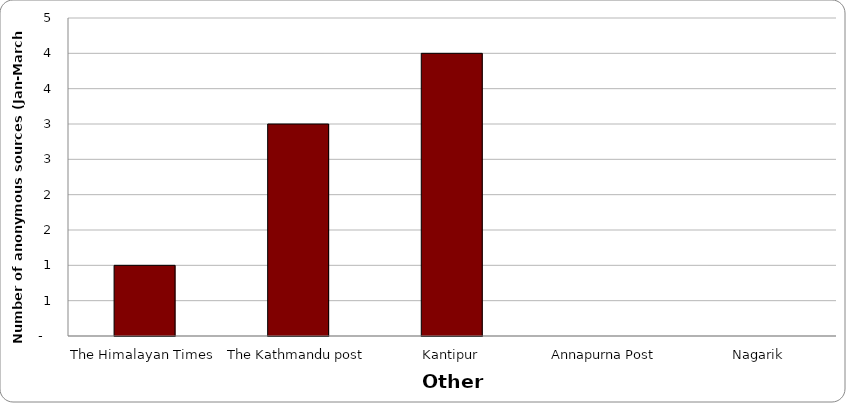
| Category | Others |
|---|---|
| The Himalayan Times | 1 |
| The Kathmandu post | 3 |
| Kantipur | 4 |
| Annapurna Post | 0 |
| Nagarik | 0 |